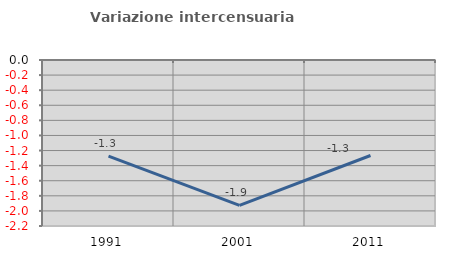
| Category | Variazione intercensuaria annua |
|---|---|
| 1991.0 | -1.273 |
| 2001.0 | -1.928 |
| 2011.0 | -1.266 |